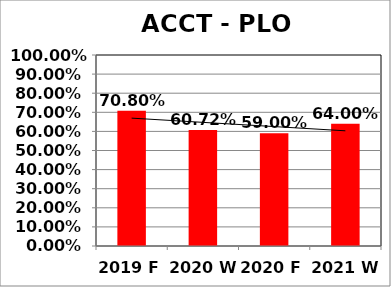
| Category | Series 0 |
|---|---|
| 2019 F | 0.708 |
| 2020 W | 0.607 |
| 2020 F | 0.59 |
| 2021 W | 0.64 |